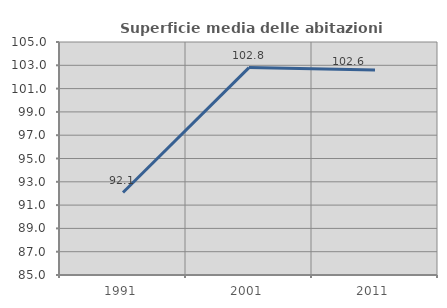
| Category | Superficie media delle abitazioni occupate |
|---|---|
| 1991.0 | 92.079 |
| 2001.0 | 102.801 |
| 2011.0 | 102.599 |